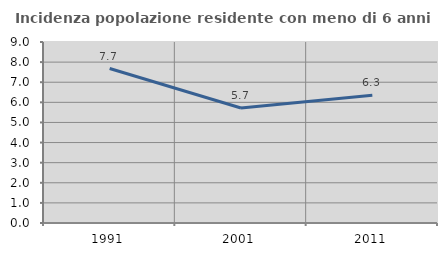
| Category | Incidenza popolazione residente con meno di 6 anni |
|---|---|
| 1991.0 | 7.682 |
| 2001.0 | 5.719 |
| 2011.0 | 6.349 |